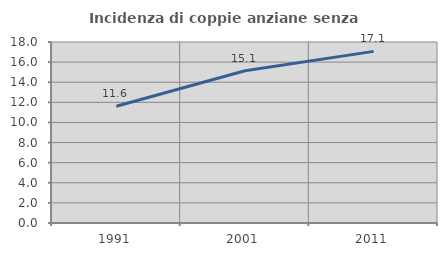
| Category | Incidenza di coppie anziane senza figli  |
|---|---|
| 1991.0 | 11.612 |
| 2001.0 | 15.135 |
| 2011.0 | 17.067 |